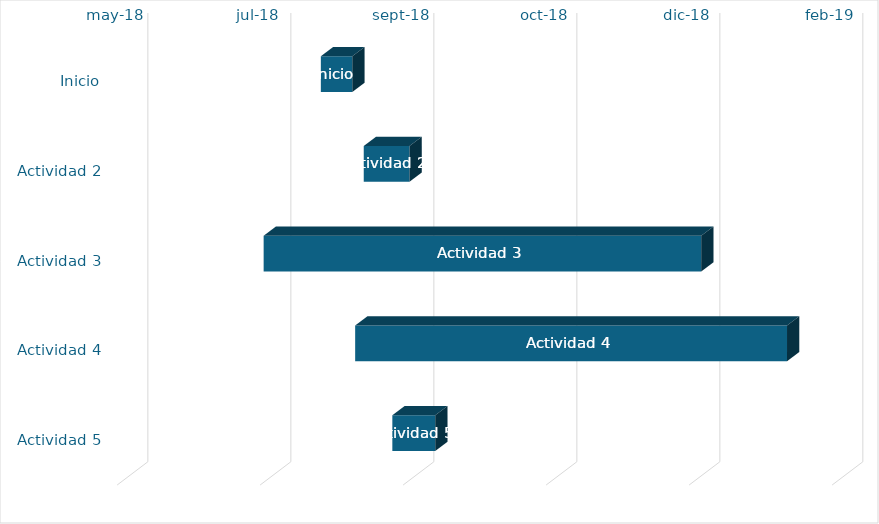
| Category | fecha | duración |
|---|---|---|
| Inicio | 8/6/18 | 11 |
| Actividad 2 | 8/21/18 | 16 |
| Actividad 3 | 7/17/18 | 153 |
| Actividad 4 | 8/18/18 | 151 |
| Actividad 5 | 8/31/18 | 15 |